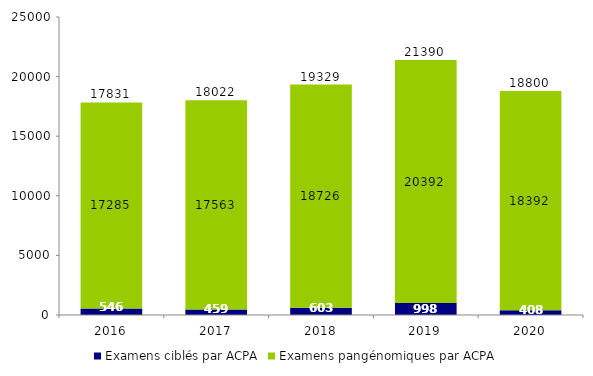
| Category | Examens ciblés par ACPA | Examens pangénomiques par ACPA | Total |
|---|---|---|---|
| 2016.0 | 546 | 17285 | 17831 |
| 2017.0 | 459 | 17563 | 18022 |
| 2018.0 | 603 | 18726 | 19329 |
| 2019.0 | 998 | 20392 | 21390 |
| 2020.0 | 408 | 18392 | 18800 |